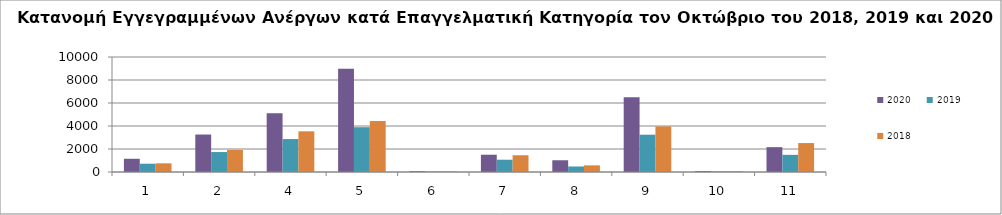
| Category | 2020 | 2019 | 2018 |
|---|---|---|---|
| 1.0 | 1150 | 721 | 754 |
| 2.0 | 3258 | 1735 | 1919 |
| 4.0 | 5110 | 2865 | 3537 |
| 5.0 | 8968 | 3896 | 4432 |
| 6.0 | 67 | 34 | 49 |
| 7.0 | 1502 | 1068 | 1457 |
| 8.0 | 1021 | 479 | 578 |
| 9.0 | 6493 | 3242 | 3960 |
| 10.0 | 78 | 48 | 75 |
| 11.0 | 2160 | 1491 | 2517 |